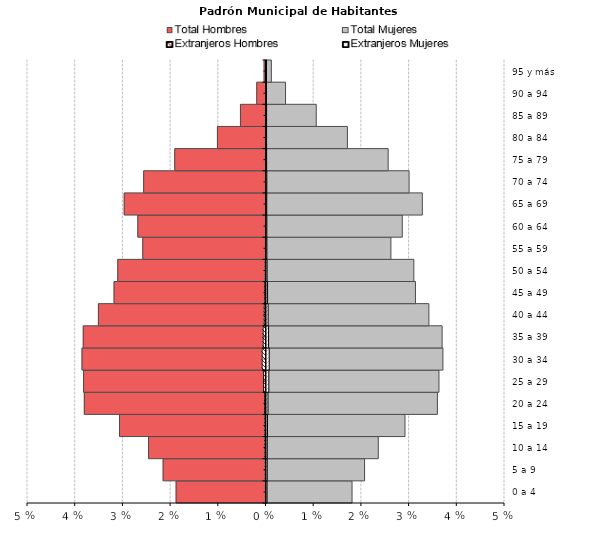
| Category | Total Hombres | Total Mujeres | Extranjeros Hombres | Extranjeros Mujeres |
|---|---|---|---|---|
| 0 a 4 | -0.019 | 0.018 | 0 | 0 |
| 5 a 9 | -0.022 | 0.021 | 0 | 0 |
| 10 a 14 | -0.025 | 0.023 | 0 | 0 |
| 15 a 19 | -0.031 | 0.029 | 0 | 0 |
| 20 a 24 | -0.038 | 0.036 | 0 | 0 |
| 25 a 29 | -0.038 | 0.036 | 0 | 0 |
| 30 a 34 | -0.039 | 0.037 | -0.001 | 0.001 |
| 35 a 39 | -0.038 | 0.037 | -0.001 | 0 |
| 40 a 44 | -0.035 | 0.034 | 0 | 0 |
| 45 a 49 | -0.032 | 0.031 | 0 | 0 |
| 50 a 54 | -0.031 | 0.031 | 0 | 0 |
| 55 a 59 | -0.026 | 0.026 | 0 | 0 |
| 60 a 64 | -0.027 | 0.028 | 0 | 0 |
| 65 a 69 | -0.03 | 0.033 | 0 | 0 |
| 70 a 74 | -0.026 | 0.03 | 0 | 0 |
| 75 a 79 | -0.019 | 0.026 | 0 | 0 |
| 80 a 84 | -0.01 | 0.017 | 0 | 0 |
| 85 a 89 | -0.005 | 0.01 | 0 | 0 |
| 90 a 94 | -0.002 | 0.004 | 0 | 0 |
| 95 y más | 0 | 0.001 | 0 | 0 |